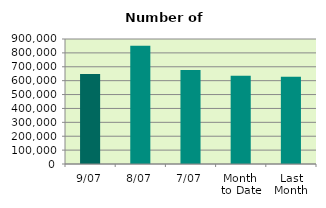
| Category | Series 0 |
|---|---|
| 9/07 | 647834 |
| 8/07 | 851558 |
| 7/07 | 676958 |
| Month 
to Date | 635615.143 |
| Last
Month | 628899 |